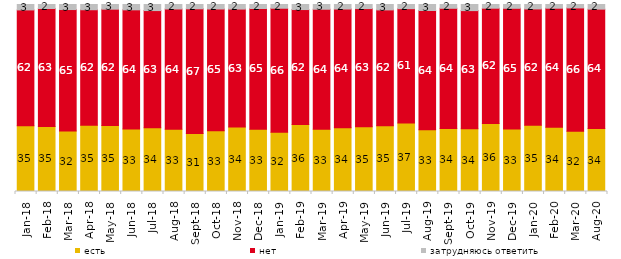
| Category | есть | нет | затрудняюсь ответить |
|---|---|---|---|
| 2018-01-01 | 35.2 | 61.9 | 2.9 |
| 2018-02-01 | 34.8 | 63.05 | 2.15 |
| 2018-03-01 | 32.35 | 64.95 | 2.7 |
| 2018-04-01 | 35.45 | 61.75 | 2.8 |
| 2018-05-01 | 35.3 | 62.15 | 2.5 |
| 2018-06-01 | 33.45 | 63.7 | 2.85 |
| 2018-07-01 | 34.05 | 62.7 | 3.25 |
| 2018-08-01 | 33.3 | 64.3 | 2.4 |
| 2018-09-01 | 31 | 66.7 | 2.3 |
| 2018-10-01 | 32.55 | 65.05 | 2.4 |
| 2018-11-01 | 34.431 | 63.124 | 2.445 |
| 2018-12-01 | 33.25 | 64.6 | 2.15 |
| 2019-01-01 | 31.75 | 66.25 | 2 |
| 2019-02-01 | 35.8 | 61.5 | 2.7 |
| 2019-03-01 | 33.317 | 64.147 | 2.536 |
| 2019-04-01 | 34.059 | 63.515 | 2.426 |
| 2019-05-01 | 34.621 | 63.2 | 2.179 |
| 2019-06-01 | 35.162 | 61.945 | 2.893 |
| 2019-07-01 | 36.634 | 61.139 | 2.228 |
| 2019-08-01 | 33.067 | 63.736 | 3.197 |
| 2019-09-01 | 33.713 | 64.257 | 2.03 |
| 2019-10-01 | 33.564 | 63.168 | 3.267 |
| 2019-11-01 | 36.337 | 61.683 | 1.98 |
| 2019-12-01 | 33.416 | 64.554 | 2.03 |
| 2020-01-01 | 35.446 | 62.178 | 2.376 |
| 2020-02-01 | 34.307 | 63.713 | 1.98 |
| 2020-03-01 | 32.226 | 65.94 | 1.834 |
| 2020-08-01 | 33.664 | 63.853 | 2.483 |